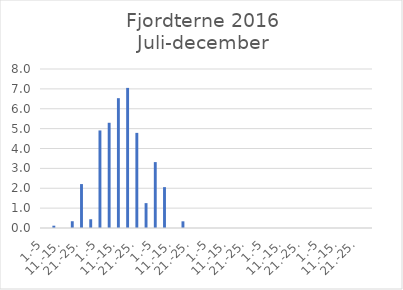
| Category | Series 0 |
|---|---|
| 1.-5 | 0 |
| 6.-10. | 0.116 |
| 11.-15. | 0 |
| 16.-20. | 0.34 |
| 21.-25. | 2.21 |
| 26.-31. | 0.44 |
| 1.-5 | 4.908 |
| 6.-10. | 5.294 |
| 11.-15. | 6.532 |
| 16.-20. | 7.049 |
| 21.-25. | 4.786 |
| 26.-31. | 1.251 |
| 1.-5 | 3.316 |
| 6.-10. | 2.056 |
| 11.-15. | 0 |
| 16.-20. | 0.336 |
| 21.-25. | 0 |
| 26.-30. | 0 |
| 1.-5 | 0 |
| 6.-10. | 0 |
| 11.-15. | 0 |
| 16.-20. | 0 |
| 21.-25. | 0 |
| 26.-31. | 0 |
| 1.-5 | 0 |
| 6.-10. | 0 |
| 11.-15. | 0 |
| 16.-20. | 0 |
| 21.-25. | 0 |
| 26.-30. | 0 |
| 1.-5 | 0 |
| 6.-10. | 0 |
| 11.-15. | 0 |
| 16.-20. | 0 |
| 21.-25. | 0 |
| 26.-31. | 0 |